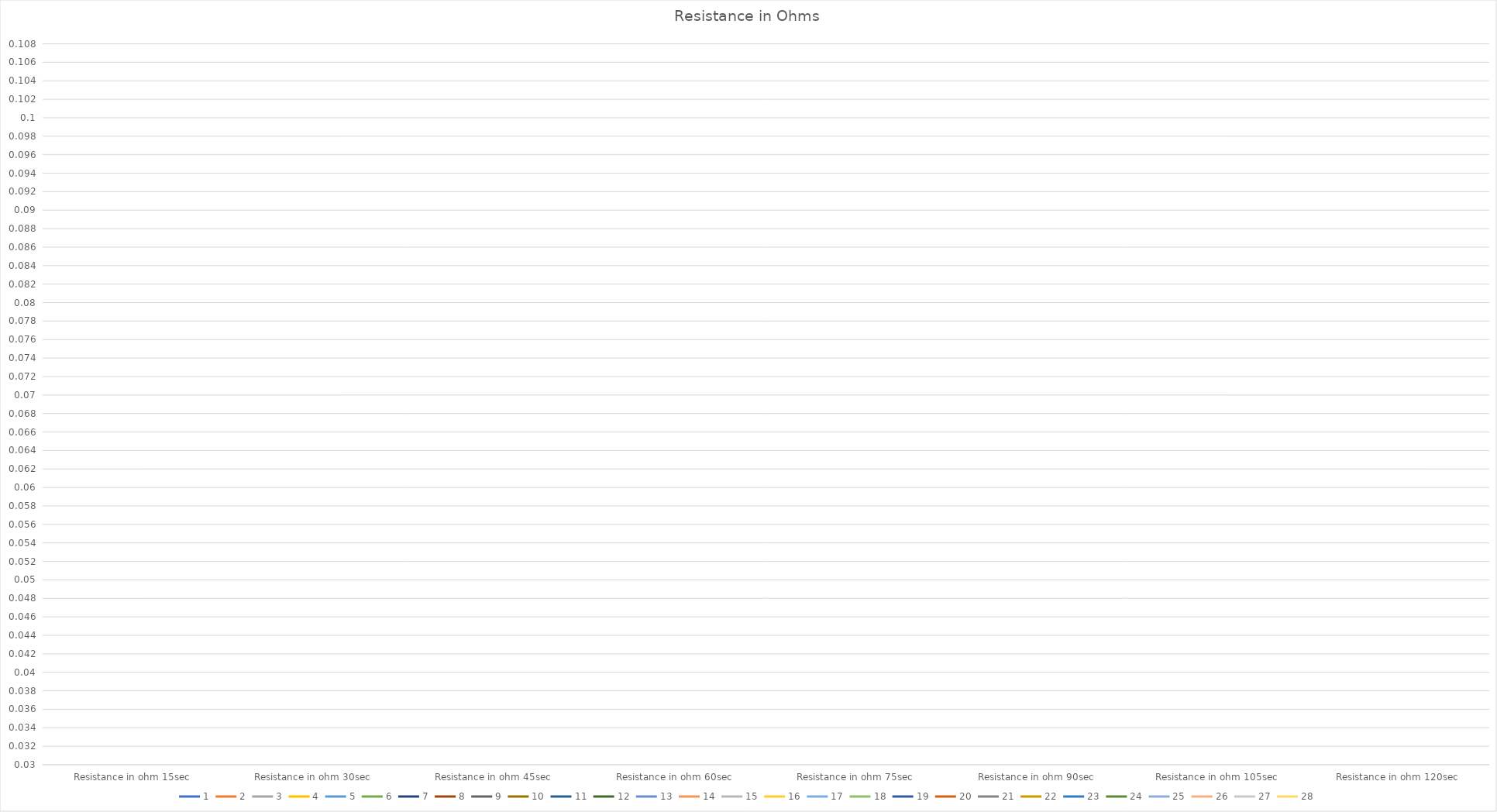
| Category | 1 | 2 | 3 | 4 | 5 | 6 | 7 | 8 | 9 | 10 | 11 | 12 | 13 | 14 | 15 | 16 | 17 | 18 | 19 | 20 | 21 | 22 | 23 | 24 | 25 | 26 | 27 | 28 |
|---|---|---|---|---|---|---|---|---|---|---|---|---|---|---|---|---|---|---|---|---|---|---|---|---|---|---|---|---|
| Resistance in ohm 15sec | 0 | 0 | 0 | 0 | 0 | 0 | 0 | 0 | 0 | 0 | 0 | 0 | 0 | 0 | 0 | 0 | 0 | 0 | 0 | 0 | 0 | 0 | 0 | 0 | 0 | 0 | 0 | 0 |
| Resistance in ohm 30sec | 0 | 0 | 0 | 0 | 0 | 0 | 0 | 0 | 0 | 0 | 0 | 0 | 0 | 0 | 0 | 0 | 0 | 0 | 0 | 0 | 0 | 0 | 0 | 0 | 0 | 0 | 0 | 0 |
| Resistance in ohm 45sec | 0 | 0 | 0 | 0 | 0 | 0 | 0 | 0 | 0 | 0 | 0 | 0 | 0 | 0 | 0 | 0 | 0 | 0 | 0 | 0 | 0 | 0 | 0 | 0 | 0 | 0 | 0 | 0 |
| Resistance in ohm 60sec | 0 | 0 | 0 | 0 | 0 | 0 | 0 | 0 | 0 | 0 | 0 | 0 | 0 | 0 | 0 | 0 | 0 | 0 | 0 | 0 | 0 | 0 | 0 | 0 | 0 | 0 | 0 | 0 |
| Resistance in ohm 75sec | 0 | 0 | 0 | 0 | 0 | 0 | 0 | 0 | 0 | 0 | 0 | 0 | 0 | 0 | 0 | 0 | 0 | 0 | 0 | 0 | 0 | 0 | 0 | 0 | 0 | 0 | 0 | 0 |
| Resistance in ohm 90sec | 0 | 0 | 0 | 0 | 0 | 0 | 0 | 0 | 0 | 0 | 0 | 0 | 0 | 0 | 0 | 0 | 0 | 0 | 0 | 0 | 0 | 0 | 0 | 0 | 0 | 0 | 0 | 0 |
| Resistance in ohm 105sec | 0 | 0 | 0 | 0 | 0 | 0 | 0 | 0 | 0 | 0 | 0 | 0 | 0 | 0 | 0 | 0 | 0 | 0 | 0 | 0 | 0 | 0 | 0 | 0 | 0 | 0 | 0 | 0 |
| Resistance in ohm 120sec | 0 | 0 | 0 | 0 | 0 | 0 | 0 | 0 | 0 | 0 | 0 | 0 | 0 | 0 | 0 | 0 | 0 | 0 | 0 | 0 | 0 | 0 | 0 | 0 | 0 | 0 | 0 | 0 |